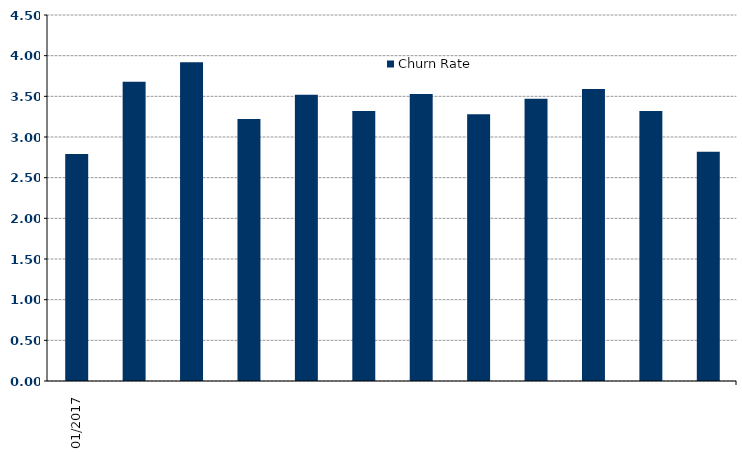
| Category | Churn Rate |
|---|---|
| 2017-01-01 | 2.79 |
| 2017-02-01 | 3.68 |
| 2017-03-01 | 3.92 |
| 2017-04-01 | 3.22 |
| 2017-05-01 | 3.52 |
| 2017-06-01 | 3.32 |
| 2017-07-01 | 3.53 |
| 2017-08-01 | 3.28 |
| 2017-09-01 | 3.47 |
| 2017-10-01 | 3.59 |
| 2017-11-01 | 3.32 |
| 2017-12-01 | 2.82 |